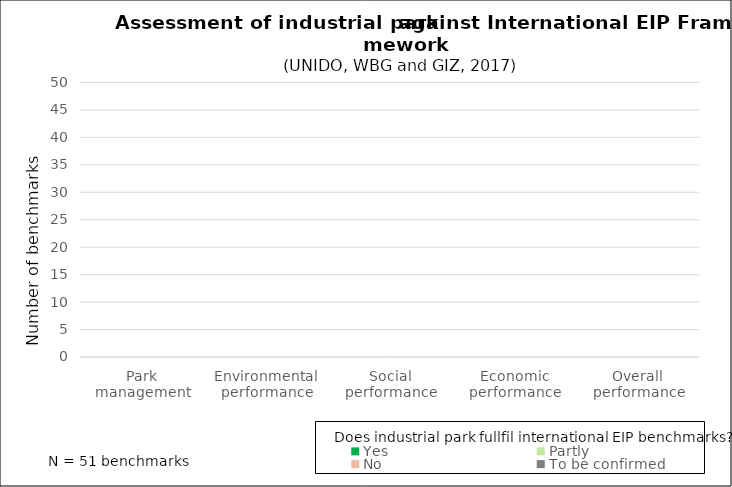
| Category | Yes | Partly | No | To be confirmed | Not applicable |
|---|---|---|---|---|---|
| Park management | 0 | 0 | 0 | 0 | 0 |
| Environmental performance | 0 | 0 | 0 | 0 | 0 |
| Social performance | 0 | 0 | 0 | 0 | 0 |
| Economic performance | 0 | 0 | 0 | 0 | 0 |
| Overall performance | 0 | 0 | 0 | 0 | 0 |